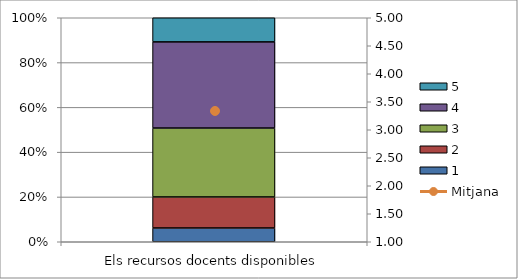
| Category | 1 | 2 | 3 | 4 | 5 |
|---|---|---|---|---|---|
| Els recursos docents disponibles | 4 | 9 | 20 | 25 | 7 |